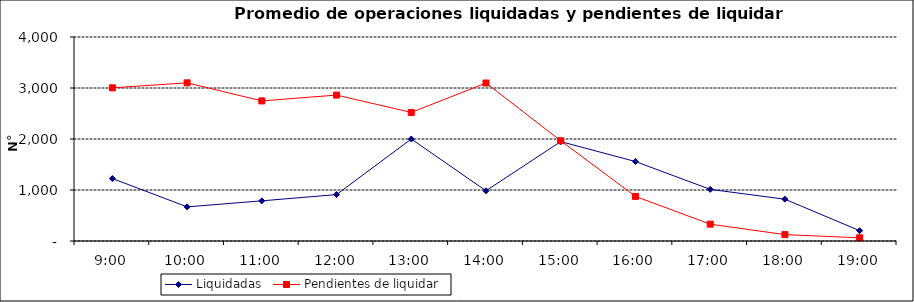
| Category | Liquidadas | Pendientes de liquidar |
|---|---|---|
| 0.375 | 1224.826 | 3003.174 |
| 0.4166666666666667 | 669.174 | 3101.174 |
| 0.4583333333333333 | 787.217 | 2747.13 |
| 0.5 | 910.13 | 2861.087 |
| 0.5416666666666666 | 2000.087 | 2520.609 |
| 0.5833333333333334 | 984.826 | 3097.435 |
| 0.625 | 1949.174 | 1965.087 |
| 0.6666666666666666 | 1558.087 | 874.435 |
| 0.7083333333333334 | 1012.522 | 330.304 |
| 0.75 | 819.522 | 124.913 |
| 0.7916666666666666 | 202.435 | 63 |